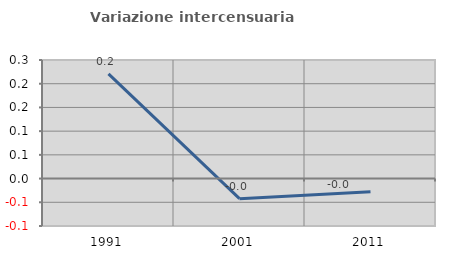
| Category | Variazione intercensuaria annua |
|---|---|
| 1991.0 | 0.221 |
| 2001.0 | -0.042 |
| 2011.0 | -0.028 |